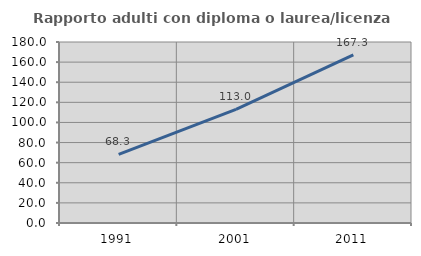
| Category | Rapporto adulti con diploma o laurea/licenza media  |
|---|---|
| 1991.0 | 68.317 |
| 2001.0 | 112.998 |
| 2011.0 | 167.262 |